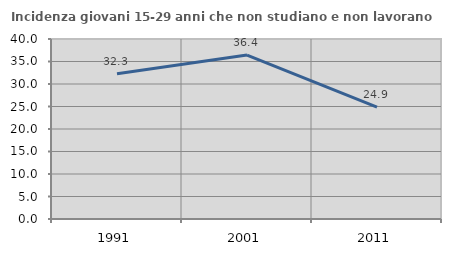
| Category | Incidenza giovani 15-29 anni che non studiano e non lavorano  |
|---|---|
| 1991.0 | 32.258 |
| 2001.0 | 36.435 |
| 2011.0 | 24.86 |